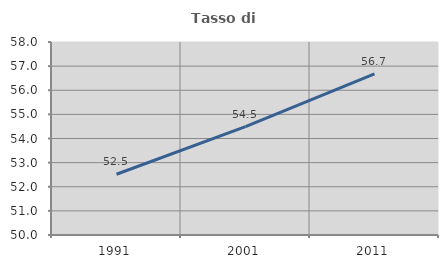
| Category | Tasso di occupazione   |
|---|---|
| 1991.0 | 52.519 |
| 2001.0 | 54.493 |
| 2011.0 | 56.681 |